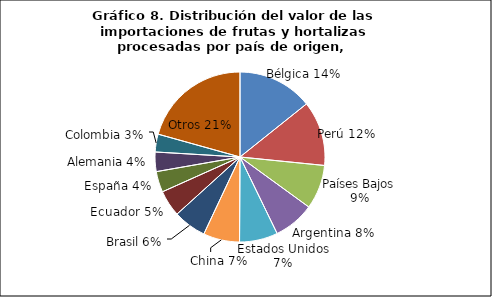
| Category | Series 0 |
|---|---|
| Bélgica | 49365425.03 |
| Perú | 42597703.14 |
| Países Bajos | 29082507.38 |
| Argentina | 26994589.52 |
| Estados Unidos | 25172597.73 |
| China | 23869564.16 |
| Brasil | 21755139.46 |
| Ecuador | 17310139.83 |
| España | 13677212.63 |
| Alemania | 12799266.83 |
| Colombia | 11718960.07 |
| Otros | 71484807.78 |